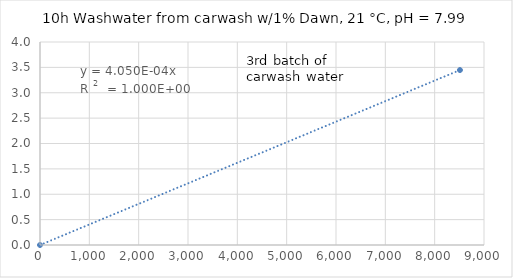
| Category | Series 0 |
|---|---|
| 0.0 | 0 |
| 8512.351576361401 | 3.447 |